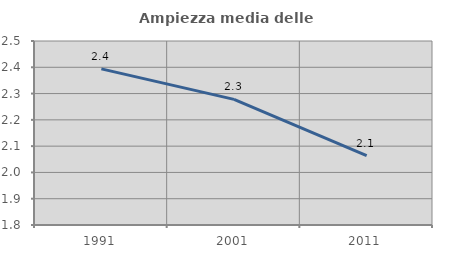
| Category | Ampiezza media delle famiglie |
|---|---|
| 1991.0 | 2.394 |
| 2001.0 | 2.278 |
| 2011.0 | 2.063 |